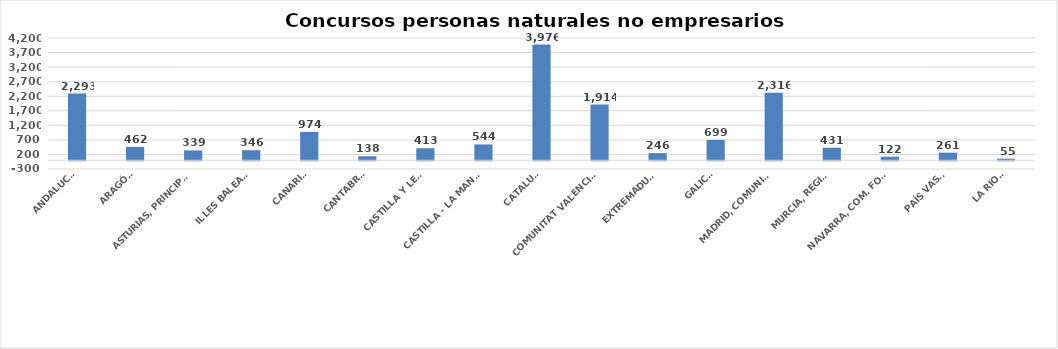
| Category | Series 0 |
|---|---|
| ANDALUCÍA | 2293 |
| ARAGÓN | 462 |
| ASTURIAS, PRINCIPADO | 339 |
| ILLES BALEARS | 346 |
| CANARIAS | 974 |
| CANTABRIA | 138 |
| CASTILLA Y LEÓN | 413 |
| CASTILLA - LA MANCHA | 544 |
| CATALUÑA | 3976 |
| COMUNITAT VALENCIANA | 1914 |
| EXTREMADURA | 246 |
| GALICIA | 699 |
| MADRID, COMUNIDAD | 2316 |
| MURCIA, REGIÓN | 431 |
| NAVARRA, COM. FORAL | 122 |
| PAÍS VASCO | 261 |
| LA RIOJA | 55 |